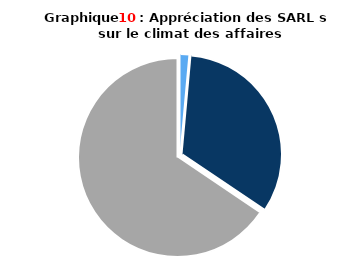
| Category | SARL |
|---|---|
|       Bonne | 0.014 |
|       Moyenne | 0.319 |
|       Médiocre | 0.634 |